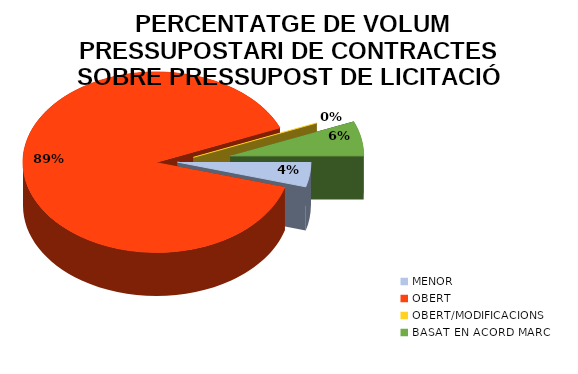
| Category |  PERCENTATGE DE VOLUM PRESSUPOSTARI DE CONTRACTES MITJANÇANT ELS PROCEDIMENTS D’ADJUDICACIÓ |
|---|---|
| MENOR | 0.044 |
| OBERT | 0.893 |
| OBERT/MODIFICACIONS | 0 |
| BASAT EN ACORD MARC | 0.062 |